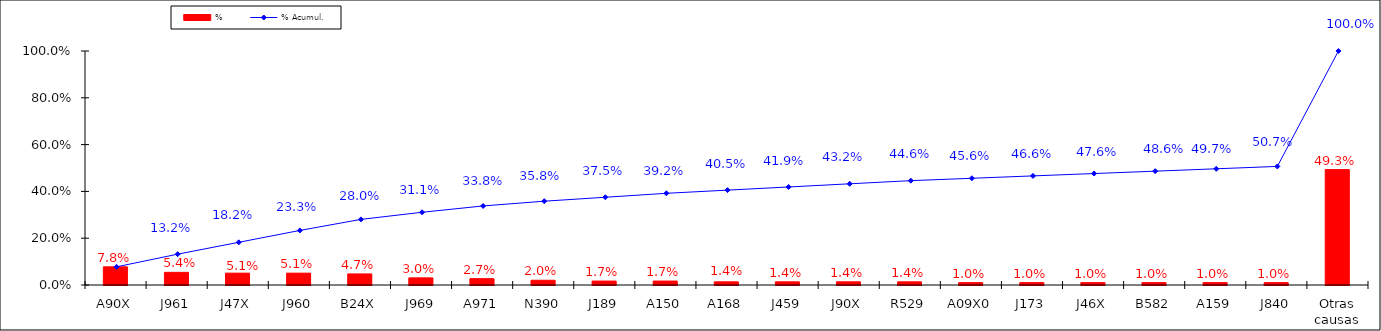
| Category | % |
|---|---|
| A90X | 0.078 |
| J961 | 0.054 |
| J47X | 0.051 |
| J960 | 0.051 |
| B24X | 0.047 |
| J969 | 0.03 |
| A971 | 0.027 |
| N390 | 0.02 |
| J189 | 0.017 |
| A150 | 0.017 |
| A168 | 0.014 |
| J459 | 0.014 |
| J90X | 0.014 |
| R529 | 0.014 |
| A09X0 | 0.01 |
| J173 | 0.01 |
| J46X | 0.01 |
| B582 | 0.01 |
| A159 | 0.01 |
| J840 | 0.01 |
| Otras causas | 0.493 |